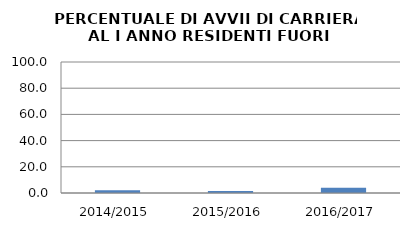
| Category | 2014/2015 2015/2016 2016/2017 |
|---|---|
| 2014/2015 | 2.143 |
| 2015/2016 | 1.504 |
| 2016/2017 | 3.922 |